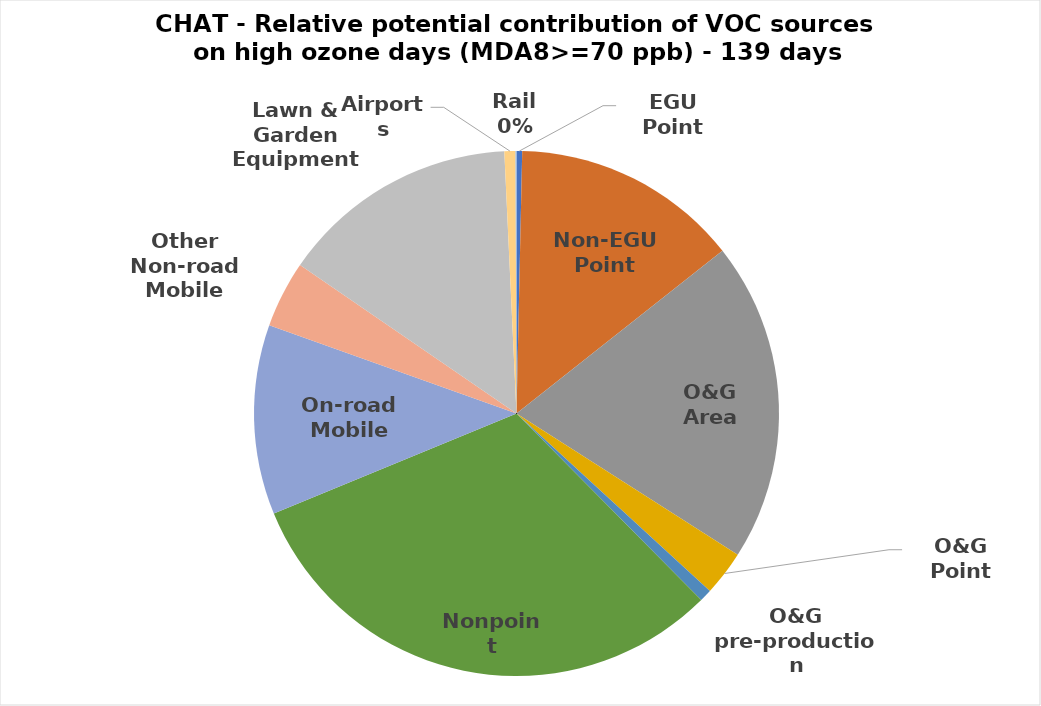
| Category | Total |
|---|---|
| EGU Point | 153.276 |
| Non-EGU Point | 6175.796 |
| O&G Area | 8680.497 |
| O&G Point | 1221.614 |
| O&G pre-production | 335.202 |
| Nonpoint | 13753.297 |
| On-road Mobile | 5148.925 |
| Other Non-road Mobile | 1814.699 |
| Lawn & Garden Equipment | 6476.644 |
| Airports | 298.878 |
| Rail | 27.06 |